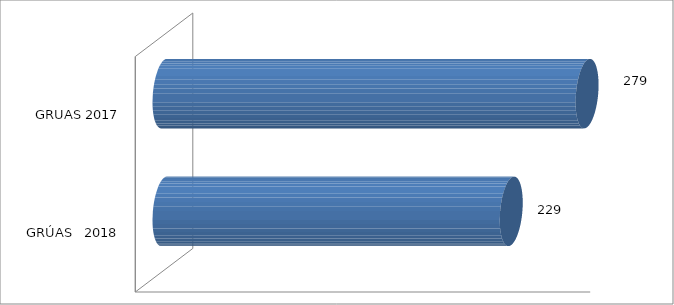
| Category | SEPTIEMBRE |
|---|---|
| GRÚAS   2018 | 229 |
| GRUAS 2017 | 279 |